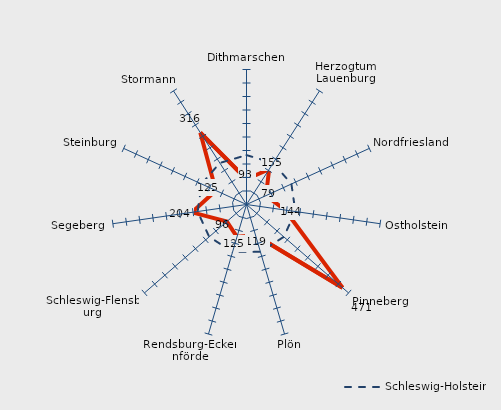
| Category | Kreise | Schleswig-Holstein |
|---|---|---|
| Dithmarschen | 93.439 | 182.851 |
| Herzogtum Lauenburg | 155.237 | 182.851 |
| Nordfriesland | 79.414 | 182.851 |
| Ostholstein | 143.992 | 182.851 |
| Pinneberg | 470.696 | 182.851 |
| Plön | 118.906 | 182.851 |
| Rendsburg-Eckernförde | 124.68 | 182.851 |
| Schleswig-Flensburg | 96.319 | 182.851 |
| Segeberg | 203.817 | 182.851 |
| Steinburg | 124.669 | 182.851 |
| Stormann | 316.455 | 182.851 |